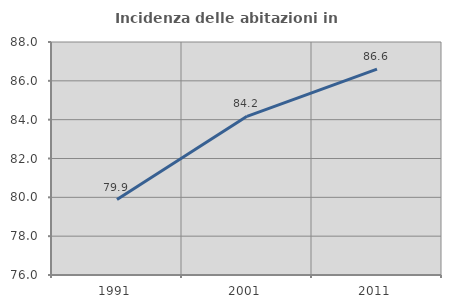
| Category | Incidenza delle abitazioni in proprietà  |
|---|---|
| 1991.0 | 79.888 |
| 2001.0 | 84.174 |
| 2011.0 | 86.602 |